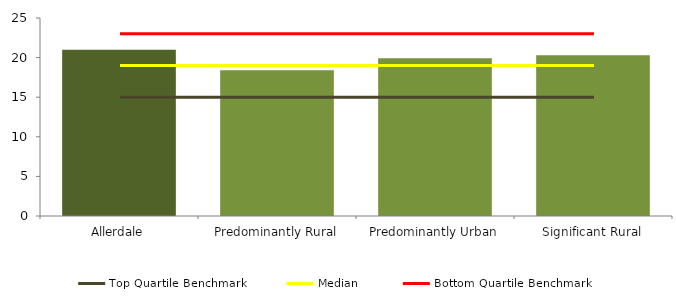
| Category | Series 0 |
|---|---|
| Allerdale | 21 |
| Predominantly Rural | 18.388 |
| Predominantly Urban | 19.907 |
| Significant Rural | 20.283 |